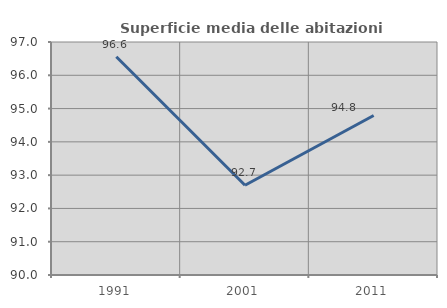
| Category | Superficie media delle abitazioni occupate |
|---|---|
| 1991.0 | 96.556 |
| 2001.0 | 92.698 |
| 2011.0 | 94.793 |